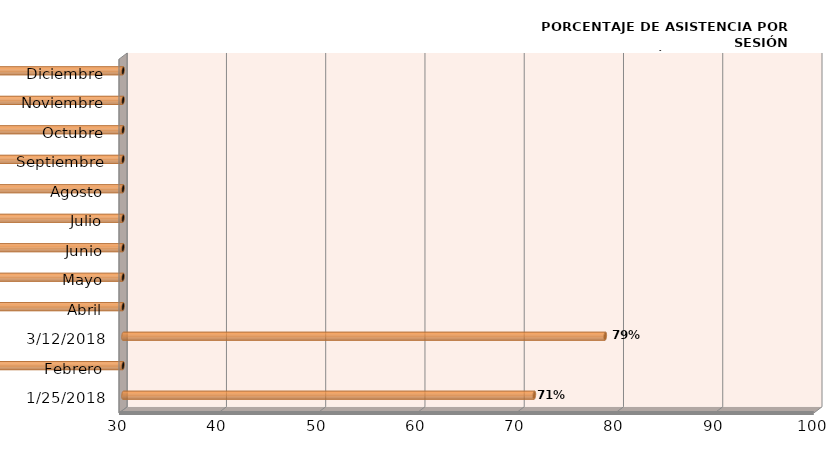
| Category | Series 0 |
|---|---|
| 25/01/2018 | 71.429 |
| Febrero | 0 |
| 12/03/2018 | 78.571 |
| Abril | 0 |
| Mayo | 0 |
| Junio | 0 |
| Julio | 0 |
| Agosto | 0 |
| Septiembre | 0 |
| Octubre | 0 |
| Noviembre | 0 |
| Diciembre | 0 |